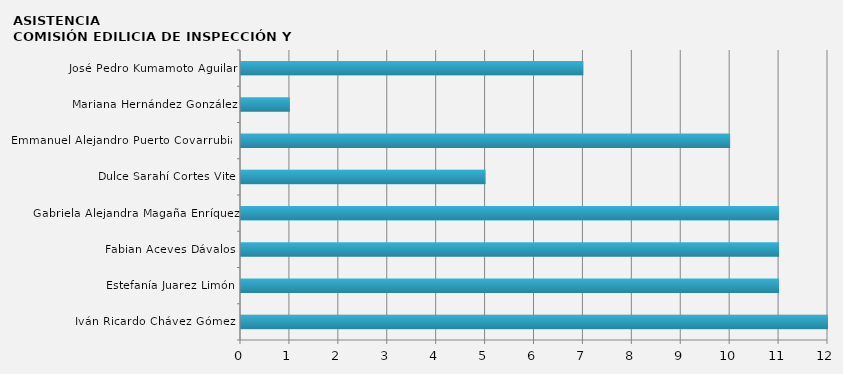
| Category | Iván Ricardo Chávez Gómez  |
|---|---|
| Iván Ricardo Chávez Gómez  | 12 |
| Estefanía Juarez Limón | 11 |
| Fabian Aceves Dávalos | 11 |
| Gabriela Alejandra Magaña Enríquez | 11 |
| Dulce Sarahí Cortes Vite | 5 |
| Emmanuel Alejandro Puerto Covarrubias | 10 |
| Mariana Hernández González | 1 |
| José Pedro Kumamoto Aguilar | 7 |